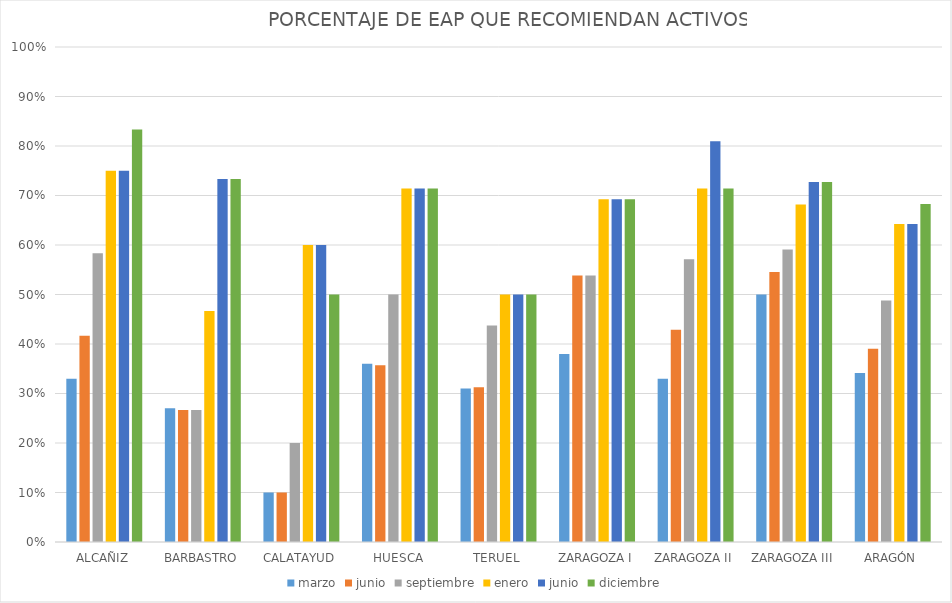
| Category | marzo | junio | septiembre | enero | diciembre |
|---|---|---|---|---|---|
| ALCAÑIZ | 0.33 | 0.75 | 0.583 | 0.75 | 0.833 |
| BARBASTRO | 0.27 | 0.733 | 0.267 | 0.467 | 0.733 |
| CALATAYUD | 0.1 | 0.6 | 0.2 | 0.6 | 0.5 |
| HUESCA | 0.36 | 0.714 | 0.5 | 0.714 | 0.714 |
| TERUEL | 0.31 | 0.5 | 0.438 | 0.5 | 0.5 |
| ZARAGOZA I | 0.38 | 0.692 | 0.538 | 0.692 | 0.692 |
| ZARAGOZA II | 0.33 | 0.81 | 0.571 | 0.714 | 0.714 |
| ZARAGOZA III | 0.5 | 0.727 | 0.591 | 0.682 | 0.727 |
| ARAGÓN | 0.341 | 0.642 | 0.488 | 0.642 | 0.683 |